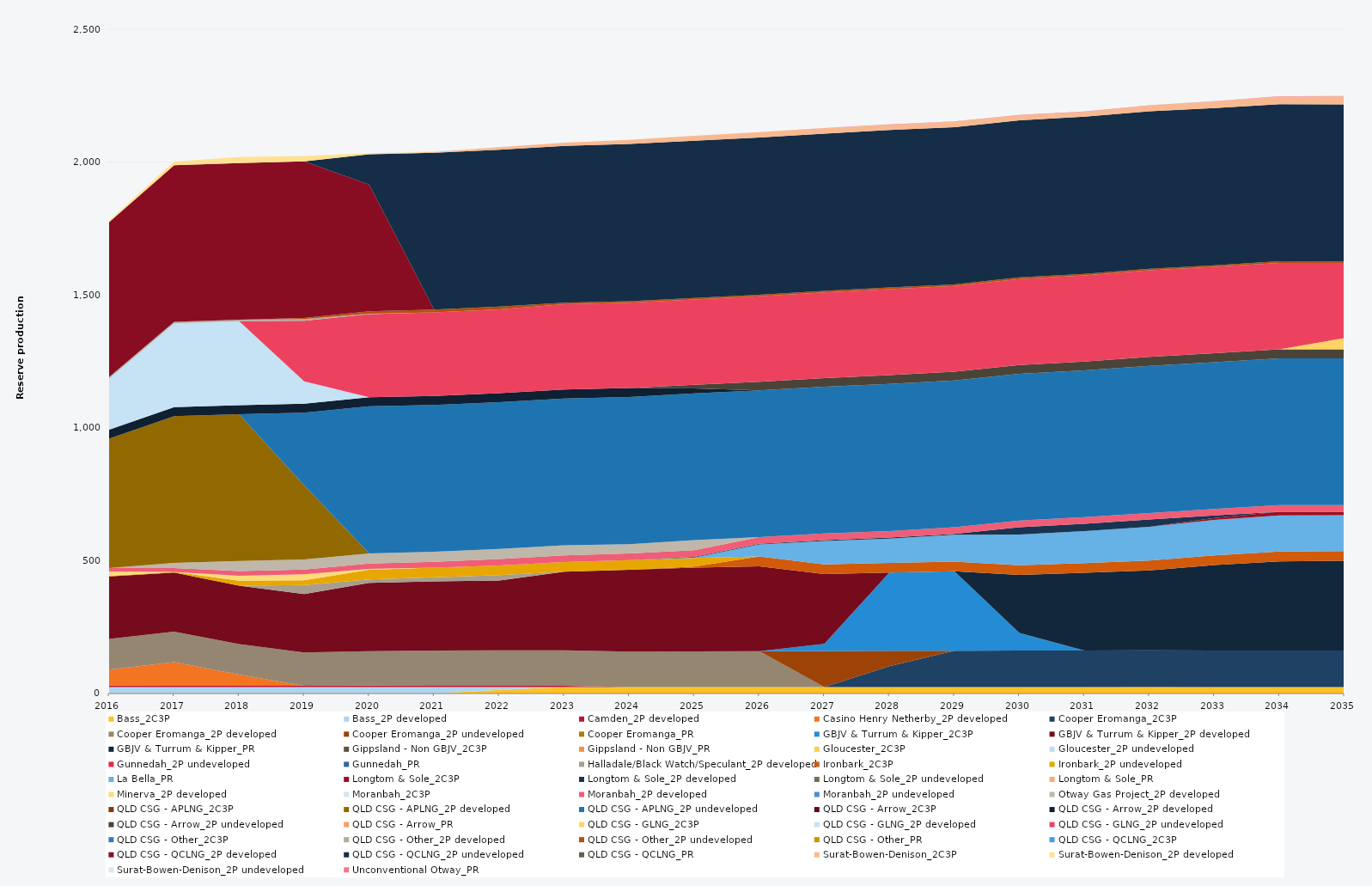
| Category | Bass_2C3P | Bass_2P developed | Camden_2P developed | Casino Henry Netherby_2P developed | Cooper Eromanga_2C3P | Cooper Eromanga_2P developed | Cooper Eromanga_2P undeveloped | Cooper Eromanga_PR | GBJV & Turrum & Kipper_2C3P | GBJV & Turrum & Kipper_2P developed | GBJV & Turrum & Kipper_PR | Gippsland - Non GBJV_2C3P | Gippsland - Non GBJV_PR | Gloucester_2C3P | Gloucester_2P undeveloped | Gunnedah_2P undeveloped | Gunnedah_PR | Halladale/Black Watch/Speculant_2P developed | Ironbark_2C3P | Ironbark_2P undeveloped | La Bella_PR | Longtom & Sole_2C3P | Longtom & Sole_2P developed | Longtom & Sole_2P undeveloped | Longtom & Sole_PR | Minerva_2P developed | Moranbah_2C3P | Moranbah_2P developed | Moranbah_2P undeveloped | Otway Gas Project_2P developed | QLD CSG - APLNG_2C3P | QLD CSG - APLNG_2P developed | QLD CSG - APLNG_2P undeveloped | QLD CSG - Arrow_2C3P | QLD CSG - Arrow_2P developed | QLD CSG - Arrow_2P undeveloped | QLD CSG - Arrow_PR | QLD CSG - GLNG_2C3P | QLD CSG - GLNG_2P developed | QLD CSG - GLNG_2P undeveloped | QLD CSG - Other_2C3P | QLD CSG - Other_2P developed | QLD CSG - Other_2P undeveloped | QLD CSG - Other_PR | QLD CSG - QCLNG_2C3P | QLD CSG - QCLNG_2P developed | QLD CSG - QCLNG_2P undeveloped | QLD CSG - QCLNG_PR | Surat-Bowen-Denison_2C3P | Surat-Bowen-Denison_2P developed | Surat-Bowen-Denison_2P undeveloped | Unconventional Otway_PR |
|---|---|---|---|---|---|---|---|---|---|---|---|---|---|---|---|---|---|---|---|---|---|---|---|---|---|---|---|---|---|---|---|---|---|---|---|---|---|---|---|---|---|---|---|---|---|---|---|---|---|---|---|---|
| 2016 | 0 | 24.522 | 5 | 60.472 | 0 | 115.657 | 0 | 0 | 0 | 235.041 | 0 | 0 | 0 | 0 | 0 | 0 | 0 | 0 | 0 | 2.597 | 0 | 0 | 0 | 0 | 0 | 16 | 0 | 13.152 | 0 | 0 | 0 | 486.488 | 0 | 0 | 34.038 | 0 | 0 | 0 | 192.101 | 0 | 0 | 5.856 | 0 | 0 | 0 | 582.654 | 0 | 0 | 0 | 5.618 | 0 | 0 |
| 2017 | 0 | 24.455 | 5 | 88.438 | 0 | 115.039 | 0 | 0 | 0 | 222.562 | 0 | 0 | 0 | 0 | 0 | 0 | 0 | 0 | 0 | 2.005 | 0 | 0 | 0 | 0 | 0 | 0 | 0 | 14.795 | 0 | 19.039 | 0 | 552.245 | 0 | 0 | 33.945 | 0 | 0 | 0 | 315.22 | 0 | 0 | 5.84 | 0 | 0 | 0 | 589.586 | 0 | 0 | 0 | 13.591 | 0 | 0 |
| 2018 | 0 | 24.455 | 5 | 41.35 | 0 | 115.271 | 0 | 0 | 0 | 220 | 0 | 0 | 0 | 0 | 0 | 0 | 0 | 0 | 0 | 18.088 | 0 | 0 | 0 | 0 | 0 | 18.735 | 0 | 17.982 | 0 | 38 | 0 | 552.245 | 0 | 0 | 33.945 | 0 | 0 | 0 | 316.326 | 0 | 0 | 5.84 | 0 | 0 | 0 | 588.729 | 0 | 0 | 0 | 23.147 | 0 | 0 |
| 2019 | 0 | 24.455 | 5 | 0 | 0 | 124.598 | 0 | 0 | 0 | 220 | 0 | 0 | 0 | 0 | 0 | 0 | 0 | 33.919 | 0 | 18.25 | 0 | 0 | 0 | 0 | 0 | 22.558 | 0 | 18.049 | 0 | 38 | 0 | 278.572 | 273.673 | 0 | 33.945 | 0 | 0 | 0 | 83.653 | 228.371 | 0 | 5.84 | 4.563 | 0 | 0 | 588.925 | 0 | 0 | 0 | 20.234 | 0 | 0 |
| 2020 | 0 | 24.522 | 5 | 0 | 0 | 129.894 | 0 | 0 | 0 | 257.268 | 0 | 0 | 0 | 0 | 0 | 0 | 0 | 12.525 | 0 | 36.6 | 0 | 0 | 0 | 0 | 0 | 3.457 | 0 | 19.619 | 0 | 38 | 0 | 0 | 553.758 | 0 | 34.038 | 0 | 0 | 0 | 0 | 313.213 | 0 | 1.624 | 8.795 | 0 | 0 | 477.506 | 113.543 | 0 | 0 | 4.226 | 0 | 0 |
| 2021 | 0 | 24.455 | 5 | 0 | 0 | 132.006 | 0 | 0 | 0 | 260.193 | 0 | 0 | 0 | 0 | 0 | 0 | 0 | 15.563 | 0 | 36.5 | 0 | 0 | 0 | 0 | 0 | 0 | 0 | 22.179 | 0 | 38 | 0 | 0 | 552.245 | 0 | 33.945 | 0 | 0 | 0 | 0 | 314.192 | 0 | 0 | 10.403 | 0 | 0 | 0 | 590.232 | 0 | 3.797 | 0 | 2 | 0 |
| 2022 | 13.672 | 10.783 | 5 | 0 | 0 | 133.177 | 0 | 0 | 0 | 262.597 | 0 | 0 | 0 | 0 | 0 | 0 | 0 | 19.992 | 0 | 36.5 | 0 | 0 | 0 | 0 | 0 | 0 | 0 | 24.141 | 0 | 38 | 0 | 0 | 552.245 | 0 | 33.945 | 0 | 0 | 0 | 0 | 315.787 | 0 | 0 | 10.403 | 0 | 0 | 0 | 590.248 | 0 | 9.743 | 0 | 0 | 0 |
| 2023 | 24.455 | 0 | 5 | 0 | 0 | 133.46 | 0 | 0 | 0 | 295.789 | 0 | 0 | 0 | 0 | 0 | 0 | 0 | 0 | 0 | 36.5 | 0 | 0 | 0 | 0 | 0 | 0 | 0 | 24.787 | 0 | 38 | 0 | 0 | 552.245 | 0 | 33.945 | 0 | 0 | 0 | 0 | 320.755 | 0 | 0 | 5.84 | 0 | 0 | 0 | 589.906 | 0 | 12.038 | 0 | 0 | 0 |
| 2024 | 24.522 | 0 | 0 | 0 | 0 | 133.338 | 0 | 0 | 0 | 307.965 | 0 | 0 | 0 | 0 | 0 | 0 | 0 | 0 | 0 | 36.6 | 0 | 0 | 0 | 0 | 0 | 0 | 0 | 24.888 | 0 | 34.567 | 0 | 0 | 553.758 | 0 | 34.038 | 0 | 0 | 0 | 0 | 321.248 | 0 | 0 | 5.856 | 0 | 0 | 0 | 591.549 | 0 | 14.999 | 0 | 0 | 0 |
| 2025 | 24.455 | 0 | 0 | 0 | 0 | 134.094 | 0 | 0 | 0 | 315.053 | 0 | 0 | 0 | 0 | 0 | 0 | 0 | 0 | 4.141 | 32.359 | 2.075 | 0 | 2.367 | 0 | 0 | 0 | 0 | 24.82 | 0 | 38 | 0 | 0 | 552.245 | 0 | 18.166 | 14.177 | 0 | 0 | 0 | 320.874 | 0 | 0 | 5.84 | 0 | 0 | 0 | 591.798 | 0 | 18.8 | 0 | 0 | 0 |
| 2026 | 24.455 | 0 | 0 | 0 | 0 | 134.465 | 0 | 0 | 0 | 320.115 | 0 | 0 | 0 | 0 | 0 | 0 | 0 | 0 | 36.5 | 0 | 45.371 | 0 | 2.723 | 0 | 0 | 0 | 0 | 24.82 | 0 | 0 | 0 | 0 | 552.245 | 0 | 0 | 32.763 | 0 | 0 | 0 | 321.752 | 0 | 0 | 5.84 | 0 | 0 | 0 | 591.755 | 0 | 19.836 | 0 | 0 | 0.385 |
| 2027 | 24.455 | 0 | 0 | 0 | 0 | 0 | 135.856 | 0 | 26.629 | 262.524 | 0 | 0 | 0 | 0 | 0 | 0 | 0 | 0 | 36.5 | 0 | 88.148 | 0 | 3.032 | 0 | 0 | 0 | 0 | 24.82 | 0 | 0 | 0 | 0 | 552.245 | 0 | 0 | 33.063 | 0 | 0 | 0 | 322.387 | 0 | 0 | 5.84 | 0 | 0 | 0 | 591.711 | 0 | 19.89 | 0 | 0 | 1.256 |
| 2028 | 24.522 | 0 | 0 | 0 | 77.923 | 0 | 58.726 | 0 | 293.862 | 0 | 0 | 0 | 0 | 0 | 0 | 0 | 0 | 0 | 36.6 | 0 | 91.715 | 0 | 3.398 | 0 | 0 | 0 | 0 | 24.888 | 0 | 0 | 0 | 0 | 553.758 | 0 | 0 | 33.212 | 0 | 0 | 0 | 323.327 | 0 | 0 | 5.856 | 0 | 0 | 0 | 593.257 | 0 | 19.502 | 0 | 0 | 0.879 |
| 2029 | 24.455 | 0 | 0 | 0 | 136.729 | 0 | 0 | 0 | 298.821 | 0 | 0 | 0 | 0 | 0 | 0 | 0 | 0 | 0 | 36.5 | 0 | 100.818 | 0 | 3.565 | 0 | 0 | 0 | 0 | 24.82 | 0 | 0 | 0 | 0 | 552.245 | 0 | 0 | 33.341 | 0 | 0 | 0 | 322.623 | 0 | 0 | 5.84 | 0 | 0 | 0 | 591.623 | 0 | 21.014 | 0 | 0 | 0.505 |
| 2030 | 24.455 | 0 | 0 | 0 | 136.875 | 0 | 0 | 0 | 66.402 | 0 | 218.673 | 0 | 0 | 0 | 0 | 0 | 0 | 0 | 36.5 | 0 | 115.597 | 0 | 27.375 | 0 | 0 | 0 | 0 | 24.82 | 0 | 0 | 0 | 0 | 552.245 | 0 | 0 | 33.547 | 0 | 0 | 0 | 323.488 | 0 | 0 | 5.84 | 0 | 0 | 0 | 591.579 | 0 | 18.425 | 0 | 0 | 1.338 |
| 2031 | 24.455 | 0 | 0 | 0 | 136.875 | 0 | 0 | 0 | 0 | 0 | 292.883 | 0 | 0 | 0 | 0 | 0 | 0 | 0 | 36.5 | 0 | 120.538 | 0 | 27.375 | 0 | 0 | 0 | 0 | 24.82 | 0 | 0 | 0 | 0 | 552.245 | 0 | 0 | 33.698 | 0 | 0 | 0 | 324.048 | 0 | 0 | 5.84 | 0 | 0 | 0 | 591.535 | 0 | 18.304 | 0 | 0 | 1.143 |
| 2032 | 24.522 | 0 | 0.913 | 0 | 137.25 | 0 | 0 | 0 | 0 | 0 | 300.923 | 0 | 0 | 0 | 0 | 0 | 0 | 0 | 36.6 | 0 | 126.955 | 0 | 27.45 | 0 | 0 | 0 | 0 | 24.888 | 0 | 0 | 0 | 0 | 553.758 | 0 | 0 | 33.929 | 0 | 0 | 0 | 325.401 | 0 | 0 | 5.856 | 0 | 0 | 0 | 593.081 | 0 | 21.103 | 0 | 0 | 1.205 |
| 2033 | 24.455 | 0 | 0.087 | 0 | 136.875 | 0 | 0 | 0 | 0 | 0 | 322.3 | 0 | 0 | 0 | 0 | 0 | 0 | 0 | 36.5 | 0 | 133.322 | 7.19 | 9.197 | 0 | 0 | 0 | 0 | 24.82 | 0 | 0 | 0 | 0 | 552.245 | 0 | 0 | 33.887 | 0 | 0 | 0 | 324.946 | 0 | 0 | 5.84 | 0 | 0 | 0 | 591.447 | 0 | 25.192 | 0 | 0 | 1.081 |
| 2034 | 24.455 | 0 | 0 | 0 | 136.875 | 0 | 0 | 0 | 0 | 0 | 336.242 | 0 | 0 | 0 | 0 | 0 | 0 | 0 | 36.5 | 0 | 136.483 | 13.79 | 0 | 0 | 0 | 0 | 0 | 24.82 | 0 | 0 | 0 | 0 | 552.245 | 0 | 0 | 33.906 | 0 | 0 | 0 | 325.249 | 0 | 0 | 5.84 | 0 | 0 | 0 | 591.403 | 0 | 28.012 | 0 | 0 | 1.64 |
| 2035 | 24.455 | 0 | 0 | 0 | 136.875 | 0 | 0 | 0 | 0 | 0 | 338.546 | 0 | 0 | 0 | 0 | 0 | 0 | 0 | 36.5 | 0 | 135.081 | 12.6 | 0 | 0 | 0 | 0 | 0 | 24.82 | 0 | 0 | 0 | 0 | 552.245 | 0 | 0 | 33.923 | 0 | 42.777 | 0 | 282.399 | 0 | 0 | 5.84 | 0 | 0 | 0 | 591.053 | 0 | 30.045 | 0 | 0 | 1.568 |